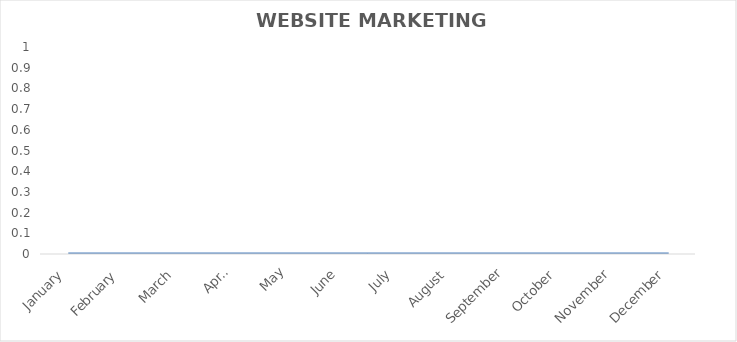
| Category | Marketing Grade |
|---|---|
| January | 0 |
| February | 0 |
| March | 0 |
| April | 0 |
| May | 0 |
| June | 0 |
| July | 0 |
| August | 0 |
| September | 0 |
| October | 0 |
| November | 0 |
| December | 0 |